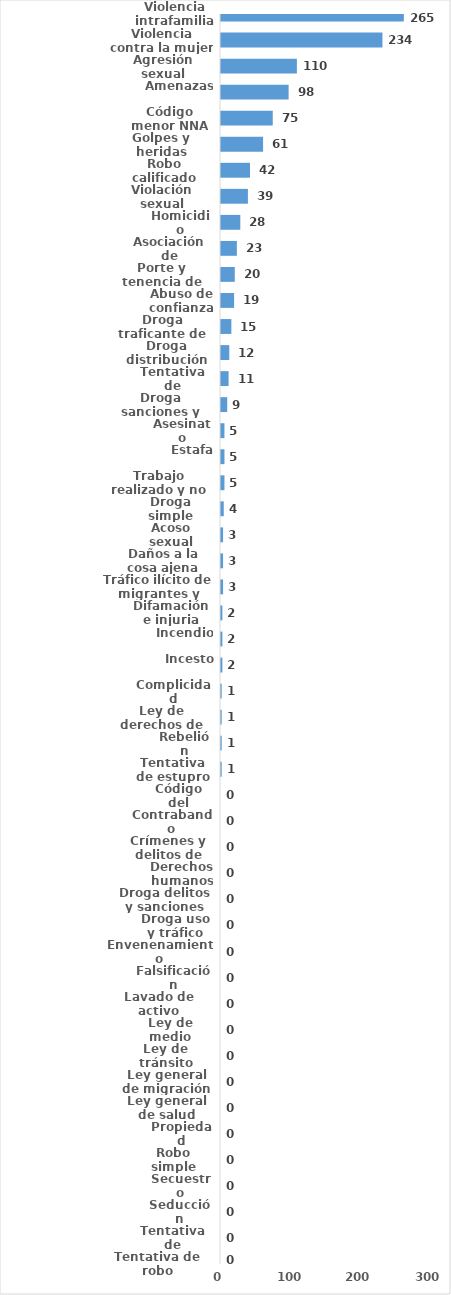
| Category | Series 0 |
|---|---|
| Violencia intrafamiliar | 265 |
| Violencia contra la mujer | 234 |
| Agresión sexual | 110 |
| Amenazas | 98 |
| Código menor NNA | 75 |
| Golpes y heridas | 61 |
| Robo calificado | 42 |
| Violación sexual | 39 |
| Homicidio | 28 |
| Asociación de malhechores | 23 |
| Porte y tenencia de armas | 20 |
| Abuso de confianza | 19 |
| Droga traficante de droga  | 15 |
| Droga distribución de droga | 12 |
| Tentativa de homicidio | 11 |
| Droga sanciones y circunstancias agravantes | 9 |
| Asesinato | 5 |
| Estafa | 5 |
| Trabajo realizado y no pagado | 5 |
| Droga simple posesión | 4 |
| Acoso sexual | 3 |
| Daños a la cosa ajena | 3 |
| Tráfico ilícito de migrantes y trata de personas | 3 |
| Difamación e injuria | 2 |
| Incendio | 2 |
| Incesto | 2 |
| Complicidad | 1 |
| Ley de derechos de autor  | 1 |
| Rebelión | 1 |
| Tentativa de estupro | 1 |
| Código del trabajo | 0 |
| Contrabando | 0 |
| Crímenes y delitos de alta tecnología | 0 |
| Derechos humanos | 0 |
| Droga delitos y sanciones | 0 |
| Droga uso y tráfico | 0 |
| Envenenamiento | 0 |
| Falsificación | 0 |
| Lavado de activo | 0 |
| Ley de medio ambiente  | 0 |
| Ley de tránsito | 0 |
| Ley general de migración | 0 |
| Ley general de salud | 0 |
| Propiedad industrial  | 0 |
| Robo simple | 0 |
| Secuestro | 0 |
| Seducción | 0 |
| Tentativa de asesinato | 0 |
| Tentativa de robo | 0 |